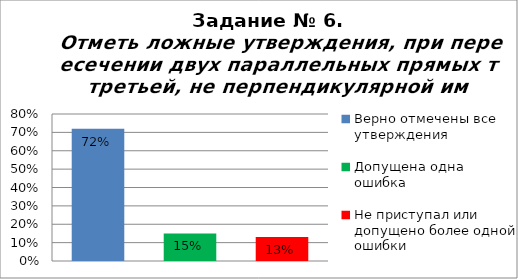
| Category | Отметь ложные утверждения, при пересечении двух параллельных прямых третьей, не перпендикулярной им. |
|---|---|
| Верно отмечены все утверждения | 0.72 |
| Допущена одна ошибка | 0.15 |
| Не приступал или допущено более одной ошибки | 0.13 |